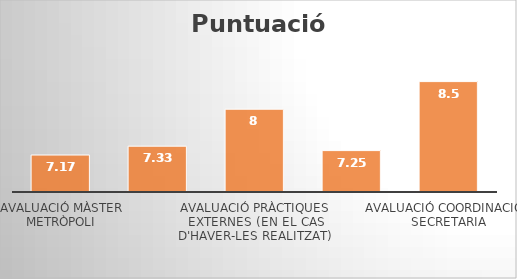
| Category | Puntuació Mitjana * |
|---|---|
| Avaluació Màster Metròpoli | 7.17 |
| Avaluació actuació docent | 7.33 |
| Avaluació Pràctiques externes (en el cas d'haver-les realitzat) | 8 |
| Avaluació Treball final de màster | 7.25 |
| Avaluació Coordinació i secretaria | 8.5 |